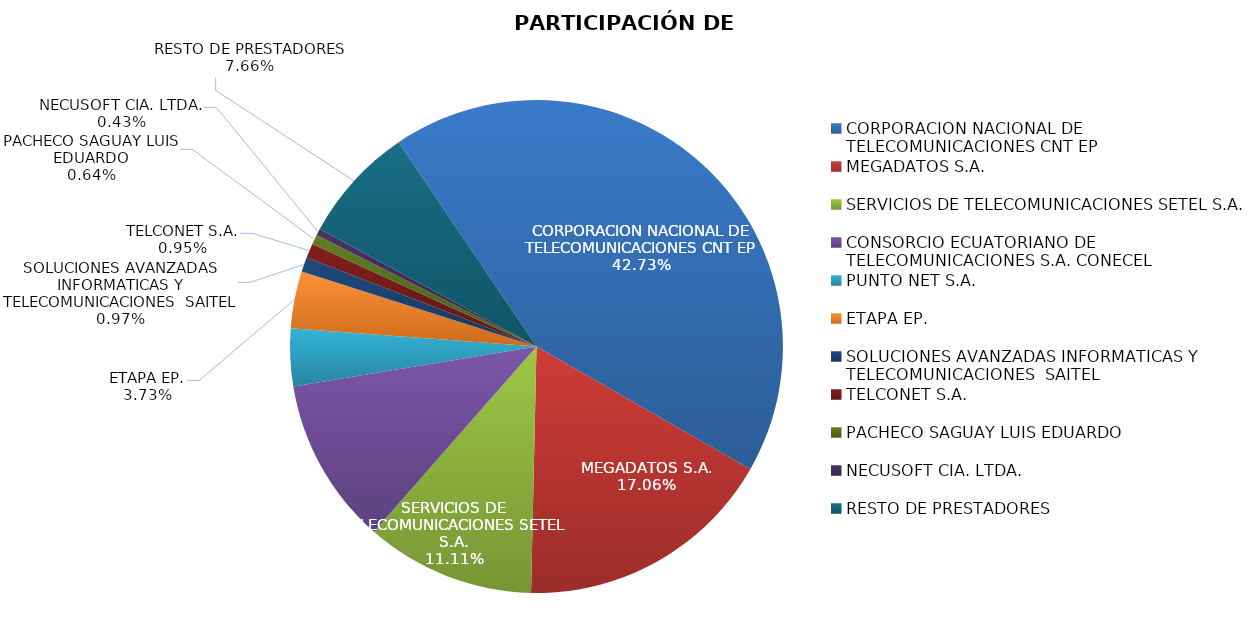
| Category | PARTICIPACIÓN DE MERCADO |
|---|---|
| CORPORACION NACIONAL DE TELECOMUNICACIONES CNT EP | 0.427 |
| MEGADATOS S.A. | 0.171 |
| SERVICIOS DE TELECOMUNICACIONES SETEL S.A. | 0.111 |
| CONSORCIO ECUATORIANO DE TELECOMUNICACIONES S.A. CONECEL | 0.109 |
| PUNTO NET S.A. | 0.038 |
| ETAPA EP. | 0.037 |
| SOLUCIONES AVANZADAS INFORMATICAS Y TELECOMUNICACIONES  SAITEL | 0.01 |
| TELCONET S.A. | 0.01 |
| PACHECO SAGUAY LUIS EDUARDO | 0.006 |
| NECUSOFT CIA. LTDA. | 0.004 |
| RESTO DE PRESTADORES | 0.077 |